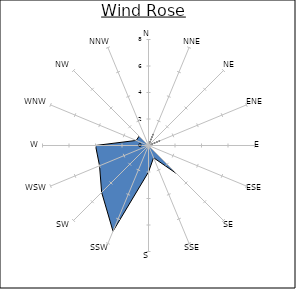
| Category | Series 0 |
|---|---|
| N | 0 |
| NNE | 1 |
| NE | 0 |
| ENE | 1 |
| E | 0 |
| ESE | 0 |
| SE | 3 |
| SSE | 1 |
| S | 2 |
| SSW | 7 |
| SW | 5 |
| WSW | 4 |
| W | 4 |
| WNW | 1 |
| NW | 1 |
| NNW | 0 |